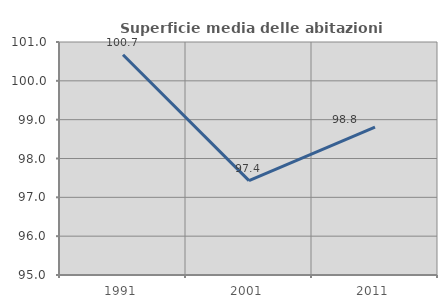
| Category | Superficie media delle abitazioni occupate |
|---|---|
| 1991.0 | 100.672 |
| 2001.0 | 97.431 |
| 2011.0 | 98.807 |